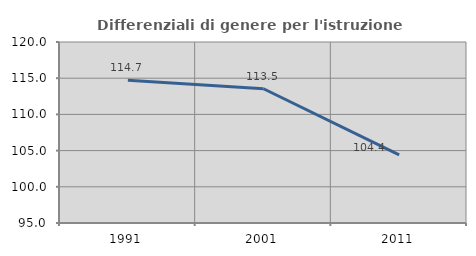
| Category | Differenziali di genere per l'istruzione superiore |
|---|---|
| 1991.0 | 114.717 |
| 2001.0 | 113.543 |
| 2011.0 | 104.398 |